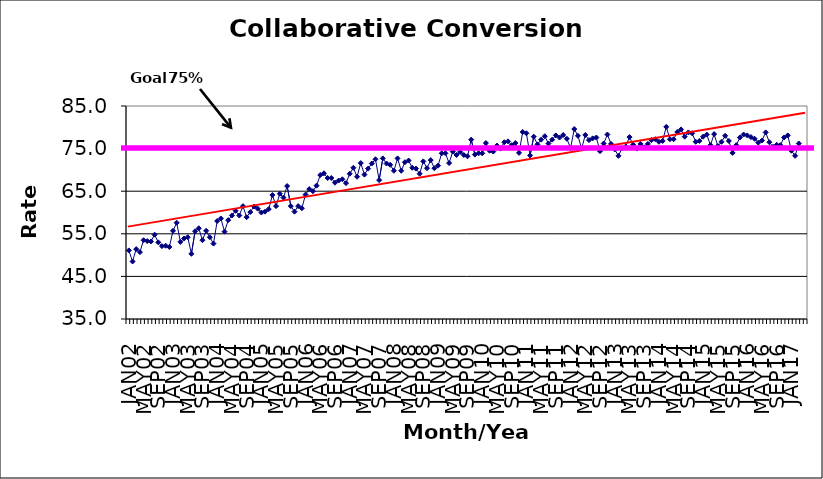
| Category | Series 0 |
|---|---|
| JAN02 | 51.1 |
| FEB02 | 48.5 |
| MAR02 | 51.4 |
| APR02 | 50.7 |
| MAY02 | 53.5 |
| JUN02 | 53.3 |
| JUL02 | 53.2 |
| AUG02 | 54.8 |
| SEP02 | 53 |
| OCT02 | 52.1 |
| NOV02 | 52.2 |
| DEC02 | 51.9 |
| JAN03 | 55.7 |
| FEB03 | 57.6 |
| MAR03 | 53.1 |
| APR03 | 53.9 |
| MAY03 | 54.2 |
| JUN03 | 50.3 |
| JUL03 | 55.6 |
| AUG03 | 56.3 |
| SEP03 | 53.5 |
| OCT03 | 55.7 |
| NOV03 | 54.2 |
| DEC03 | 52.7 |
| JAN04 | 58 |
| FEB04 | 58.6 |
| MAR04 | 55.5 |
| APR04 | 58.2 |
| MAY04 | 59.3 |
| JUN04 | 60.4 |
| JUL04 | 59.3 |
| AUG04 | 61.5 |
| SEP04 | 58.9 |
| OCT04 | 60.1 |
| NOV04 | 61.4 |
| DEC04 | 60.9 |
| JAN05 | 60 |
| FEB05 | 60.2 |
| MAR05 | 60.8 |
| APR05 | 64.1 |
| MAY05 | 61.5 |
| JUN05 | 64.4 |
| JUL05 | 63.5 |
| AUG05 | 66.2 |
| SEP05 | 61.5 |
| OCT05 | 60.2 |
| NOV05 | 61.5 |
| DEC05 | 61 |
| JAN06 | 64.2 |
| FEB06 | 65.5 |
| MAR06 | 65 |
| APR06 | 66.3 |
| MAY06 | 68.8 |
| JUN06 | 69.2 |
| JUL06 | 68.1 |
| AUG06 | 68.1 |
| SEP06 | 67 |
| OCT06 | 67.5 |
| NOV06 | 67.8 |
| DEC06 | 66.9 |
| JAN07 | 69.1 |
| FEB07 | 70.5 |
| MAR07 | 68.4 |
| APR07 | 71.6 |
| MAY07 | 68.9 |
| JUN07 | 70.3 |
| JUL07 | 71.5 |
| AUG07 | 72.5 |
| SEP07 | 67.6 |
| OCT07 | 72.7 |
| NOV07 | 71.5 |
| DEC07 | 71.2 |
| JAN08 | 69.8 |
| FEB08 | 72.7 |
| MAR08 | 69.8 |
| APR08 | 71.8 |
| MAY08 | 72.2 |
| JUN08 | 70.5 |
| JUL08 | 70.3 |
| AUG08 | 69.1 |
| SEP08 | 72 |
| OCT08 | 70.4 |
| NOV08 | 72.3 |
| DEC08 | 70.4 |
| JAN09 | 71 |
| FEB09 | 73.9 |
| MAR09 | 73.9 |
| APR09 | 71.6 |
| MAY09 | 74.3 |
| JUN09 | 73.5 |
| JUL09 | 74.2 |
| AUG09 | 73.5 |
| SEP09 | 73.2 |
| OCT09 | 77.1 |
| NOV09 | 73.6 |
| DEC09 | 73.9 |
| JAN10 | 73.9 |
| FEB10 | 76.3 |
| MAR10 | 74.5 |
| APR10 | 74.3 |
| MAY10 | 75.7 |
| JUN10 | 75 |
| JUL10 | 76.5 |
| AUG10 | 76.7 |
| SEP10 | 75.8 |
| OCT10 | 76.3 |
| NOV10 | 74 |
| DEC10 | 78.9 |
| JAN11 | 78.6 |
| FEB11 | 73.4 |
| MAR11 | 77.8 |
| APR11 | 76 |
| MAY11 | 77.1 |
| JUN11 | 77.9 |
| JUL11 | 76.2 |
| AUG11 | 77.1 |
| SEP11 | 78.1 |
| OCT11 | 77.6 |
| NOV11 | 78.2 |
| DEC11 | 77.3 |
| JAN12 | 75.1 |
| FEB12 | 79.6 |
| MAR12 | 78 |
| APR12 | 75 |
| MAY12 | 78.2 |
| JUN12 | 77 |
| JUL12 | 77.4 |
| AUG12 | 77.6 |
| SEP12 | 74.4 |
| OCT12 | 76.2 |
| NOV12 | 78.3 |
| DEC12 | 76.1 |
| JAN13 | 74.8 |
| FEB13 | 73.3 |
| MAR13 | 75.1 |
| APR13 | 75.5 |
| MAY13 | 77.7 |
| JUN13 | 75.9 |
| JUL13 | 75 |
| AUG13 | 76.1 |
| SEP13 | 75.3 |
| OCT13 | 76.1 |
| NOV13 | 77 |
| DEC13 | 77.2 |
| JAN14 | 76.6 |
| FEB14 | 76.8 |
| MAR14 | 80.1 |
| APR14 | 77.2 |
| MAY14 | 77.2 |
| JUN14 | 78.9 |
| JUL14 | 79.5 |
| AUG14 | 77.8 |
| SEP14 | 78.8 |
| OCT14 | 78.6 |
| NOV14 | 76.6 |
| DEC14 | 76.8 |
| JAN15 | 77.8 |
| FEB15 | 78.3 |
| MAR15 | 75.8 |
| APR15 | 78.4 |
| MAY15 | 75.6 |
| JUN15 | 76.6 |
| JUL15 | 78 |
| AUG15 | 76.8 |
| SEP15 | 74 |
| OCT15 | 75.8 |
| NOV15 | 77.6 |
| DEC15 | 78.3 |
| JAN16 | 78.1 |
| FEB16 | 77.7 |
| MAR16 | 77.3 |
| APR16 | 76.4 |
| MAY16 | 76.9 |
| JUN16 | 78.8 |
| JUL16 | 76.5 |
| AUG16 | 75.4 |
| SEP16 | 75.9 |
| OCT16 | 75.8 |
| NOV16 | 77.6 |
| DEC16 | 78.1 |
| JAN17 | 74.5 |
| FEB17 | 73.3 |
| MAR17 | 76.2 |